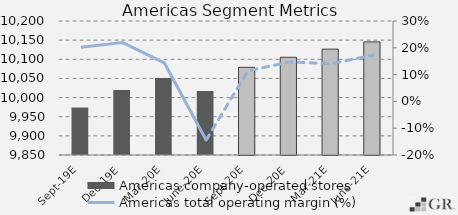
| Category | Americas company-operated stores |
|---|---|
|  Sept-19E  | 9974 |
|  Dec-19E  | 10020 |
|  Mar-20E  | 10051 |
|  June-20E  | 10017 |
|  Sept-20E  | 10079 |
|  Dec-20E  | 10105.25 |
|  Mar-21E  | 10126.562 |
|  June-21E  | 10145.453 |